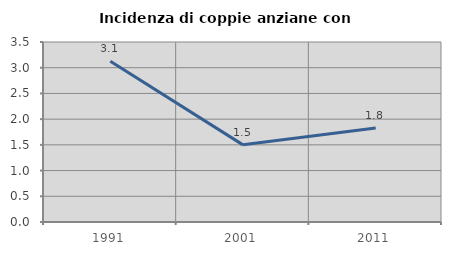
| Category | Incidenza di coppie anziane con figli |
|---|---|
| 1991.0 | 3.125 |
| 2001.0 | 1.5 |
| 2011.0 | 1.826 |